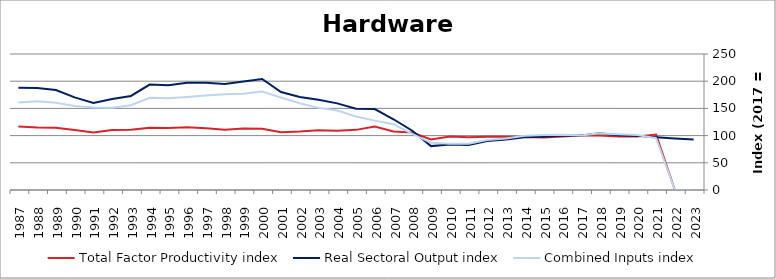
| Category | Total Factor Productivity index | Real Sectoral Output index | Combined Inputs index |
|---|---|---|---|
| 2023.0 | 0 | 92.719 | 0 |
| 2022.0 | 0 | 94.819 | 0 |
| 2021.0 | 101.98 | 97.14 | 95.255 |
| 2020.0 | 98.489 | 99.491 | 101.018 |
| 2019.0 | 98.215 | 100.663 | 102.492 |
| 2018.0 | 100.371 | 104.473 | 104.087 |
| 2017.0 | 100 | 100 | 100 |
| 2016.0 | 98.206 | 99.828 | 101.652 |
| 2015.0 | 96.532 | 97.743 | 101.255 |
| 2014.0 | 97.293 | 96.94 | 99.637 |
| 2013.0 | 97.897 | 92.693 | 94.684 |
| 2012.0 | 98.053 | 90.174 | 91.964 |
| 2011.0 | 97.067 | 82.576 | 85.071 |
| 2010.0 | 98.332 | 83.656 | 85.075 |
| 2009.0 | 93.013 | 80.66 | 86.718 |
| 2008.0 | 105.528 | 108.912 | 103.207 |
| 2007.0 | 107.534 | 130.019 | 120.91 |
| 2006.0 | 116.663 | 148.738 | 127.494 |
| 2005.0 | 110.55 | 149.248 | 135.004 |
| 2004.0 | 108.911 | 159.244 | 146.215 |
| 2003.0 | 109.785 | 165.744 | 150.972 |
| 2002.0 | 107.336 | 171.075 | 159.382 |
| 2001.0 | 106.015 | 180.136 | 169.916 |
| 2000.0 | 112.671 | 204.025 | 181.08 |
| 1999.0 | 112.85 | 199.474 | 176.76 |
| 1998.0 | 110.54 | 194.654 | 176.094 |
| 1997.0 | 113.684 | 197.326 | 173.574 |
| 1996.0 | 115.392 | 197.215 | 170.908 |
| 1995.0 | 114.044 | 192.508 | 168.802 |
| 1994.0 | 114.316 | 193.758 | 169.493 |
| 1993.0 | 110.859 | 172.902 | 155.966 |
| 1992.0 | 110.433 | 167.107 | 151.319 |
| 1991.0 | 105.594 | 159.987 | 151.512 |
| 1990.0 | 110.155 | 170.225 | 154.532 |
| 1989.0 | 114.584 | 183.672 | 160.294 |
| 1988.0 | 114.74 | 187.331 | 163.266 |
| 1987.0 | 116.739 | 187.909 | 160.965 |